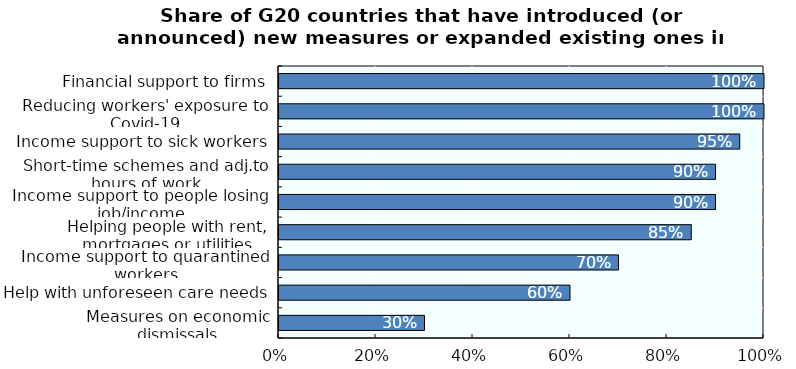
| Category | Series 0 |
|---|---|
| Financial support to firms | 1 |
| Reducing workers' exposure to Covid-19 | 1 |
| Income support to sick workers | 0.95 |
| Short-time schemes and adj.to hours of work | 0.9 |
| Income support to people losing job/income | 0.9 |
| Helping people with rent, mortgages or utilities | 0.85 |
| Income support to quarantined workers | 0.7 |
| Help with unforeseen care needs | 0.6 |
| Measures on economic dismissals | 0.3 |